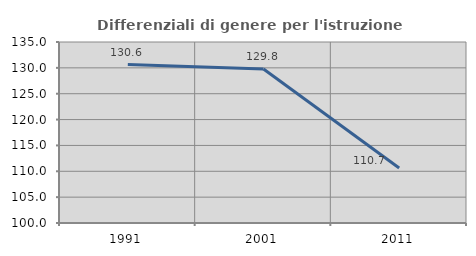
| Category | Differenziali di genere per l'istruzione superiore |
|---|---|
| 1991.0 | 130.637 |
| 2001.0 | 129.778 |
| 2011.0 | 110.65 |